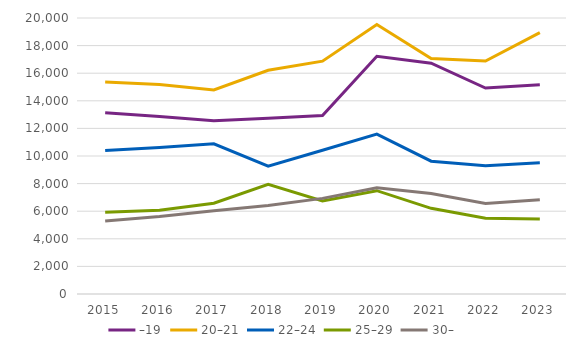
| Category | –19 | 20–21 | 22–24 | 25–29 | 30– |
|---|---|---|---|---|---|
| 2015.0 | 13133 | 15360 | 10405 | 5923 | 5292 |
| 2016.0 | 12870 | 15180 | 10610 | 6070 | 5610 |
| 2017.0 | 12560 | 14790 | 10880 | 6580 | 6040 |
| 2018.0 | 12730 | 16210 | 9260 | 7950 | 6410 |
| 2019.0 | 12940 | 16870 | 10420 | 6750 | 6930 |
| 2020.0 | 17227 | 19529 | 11583 | 7487 | 7694 |
| 2021.0 | 16724 | 17057 | 9622 | 6210 | 7284 |
| 2022.0 | 14925 | 16881 | 9295 | 5487 | 6552 |
| 2023.0 | 15159 | 18944 | 9508 | 5430 | 6837 |